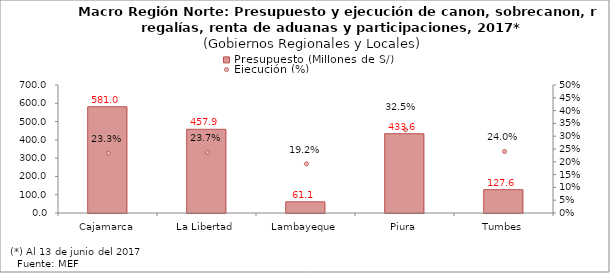
| Category | Presupuesto (Millones de S/) |
|---|---|
| Cajamarca | 580.98 |
| La Libertad | 457.907 |
| Lambayeque | 61.097 |
| Piura | 433.623 |
| Tumbes | 127.58 |